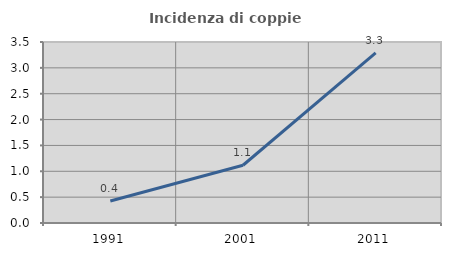
| Category | Incidenza di coppie miste |
|---|---|
| 1991.0 | 0.426 |
| 2001.0 | 1.117 |
| 2011.0 | 3.29 |